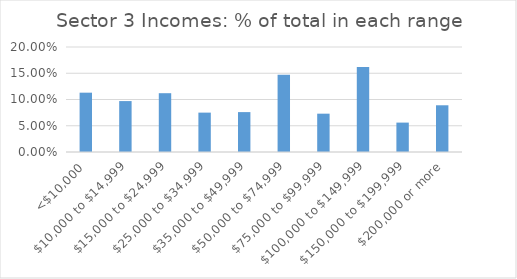
| Category | Series 0 |
|---|---|
| <$10,000 | 0.113 |
| $10,000 to $14,999 | 0.097 |
| $15,000 to $24,999 | 0.112 |
| $25,000 to $34,999 | 0.075 |
| $35,000 to $49,999 | 0.076 |
| $50,000 to $74,999 | 0.147 |
| $75,000 to $99,999 | 0.073 |
| $100,000 to $149,999 | 0.162 |
| $150,000 to $199,999 | 0.056 |
| $200,000 or more | 0.089 |